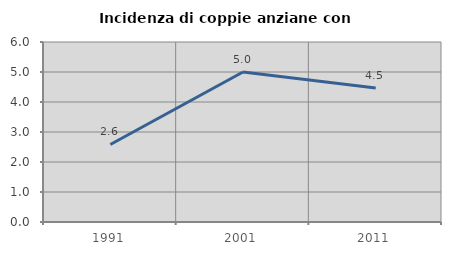
| Category | Incidenza di coppie anziane con figli |
|---|---|
| 1991.0 | 2.584 |
| 2001.0 | 5 |
| 2011.0 | 4.467 |